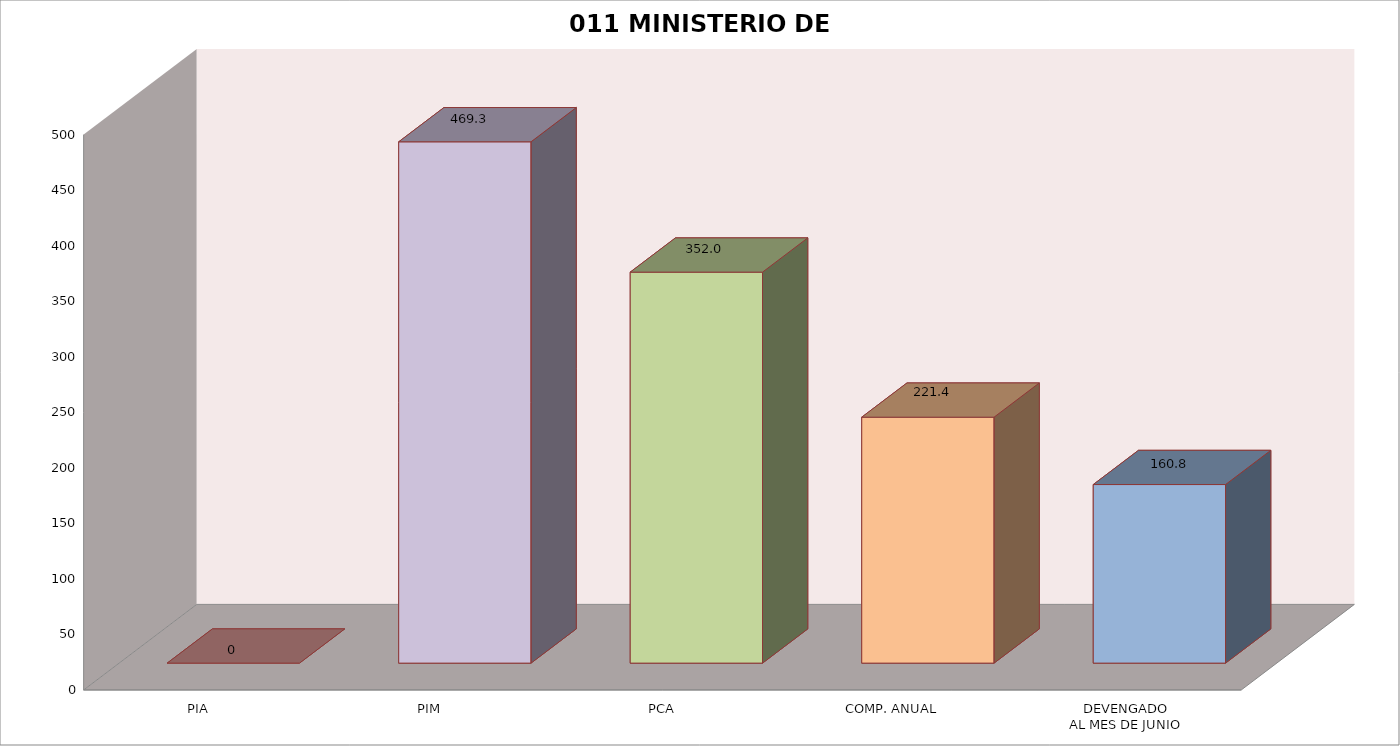
| Category | 011 MINISTERIO DE SALUD |
|---|---|
| PIA | 0 |
| PIM | 469.324 |
| PCA | 351.993 |
| COMP. ANUAL | 221.409 |
| DEVENGADO
AL MES DE JUNIO | 160.765 |